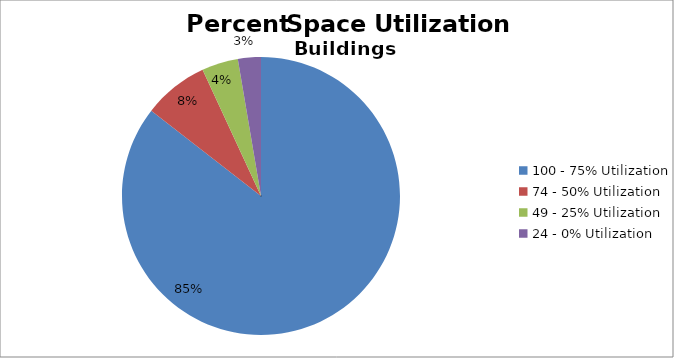
| Category | Series 0 |
|---|---|
| 100 - 75% Utilization | 144126 |
| 74 - 50% Utilization | 12762 |
| 49 - 25% Utilization | 7132 |
| 24 - 0% Utilization | 4500 |